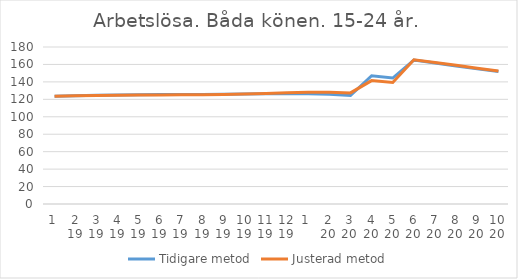
| Category | Tidigare metod | Justerad metod |
|---|---|---|
| 0 | 123.47 | 123.58 |
| 1 | 124.15 | 124.18 |
| 2 | 124.57 | 124.5 |
| 3 | 124.87 | 124.71 |
| 4 | 125.16 | 124.92 |
| 5 | 125.41 | 125.08 |
| 6 | 125.56 | 125.17 |
| 7 | 125.65 | 125.28 |
| 8 | 125.77 | 125.54 |
| 9 | 125.98 | 126.04 |
| 10 | 126.26 | 126.75 |
| 11 | 126.5 | 127.54 |
| 12 | 126.44 | 128.11 |
| 13 | 125.79 | 128.11 |
| 14 | 124.41 | 127.36 |
| 15 | 147.06 | 141.49 |
| 16 | 144.39 | 139.31 |
| 17 | 164.99 | 165.41 |
| 18 | 161.67 | 162.31 |
| 19 | 158.25 | 158.99 |
| 20 | 154.93 | 155.67 |
| 21 | 151.9 | 152.57 |